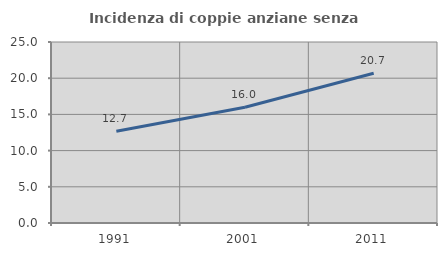
| Category | Incidenza di coppie anziane senza figli  |
|---|---|
| 1991.0 | 12.661 |
| 2001.0 | 15.987 |
| 2011.0 | 20.69 |